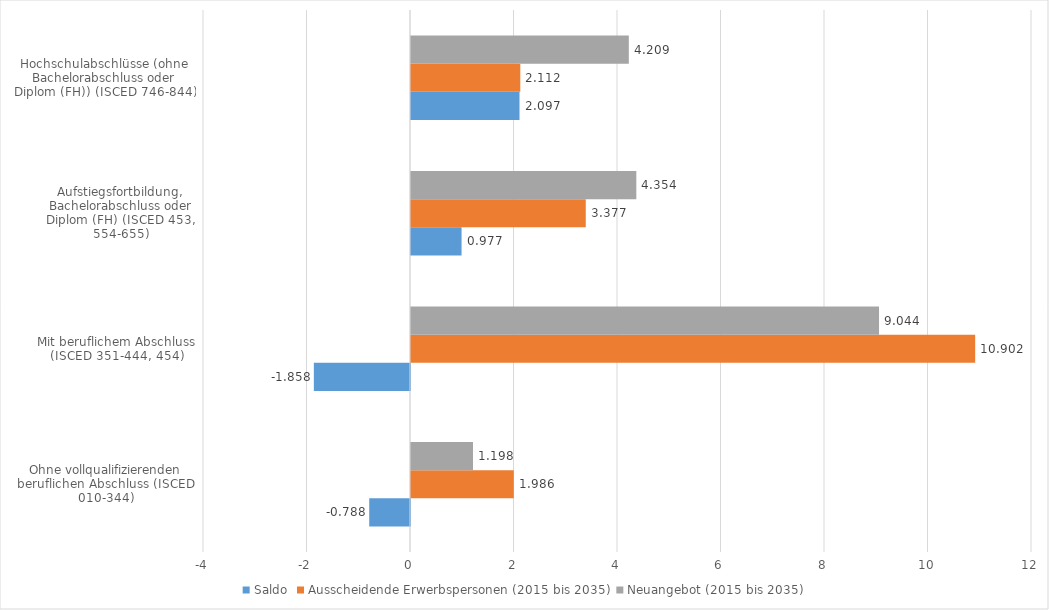
| Category | Saldo | Ausscheidende Erwerbspersonen (2015 bis 2035) | Neuangebot (2015 bis 2035) |
|---|---|---|---|
| Ohne vollqualifizierenden beruflichen Abschluss (ISCED 010-344) | -0.788 | 1.986 | 1.198 |
| Mit beruflichem Abschluss (ISCED 351-444, 454) | -1.858 | 10.902 | 9.044 |
| Aufstiegsfortbildung, Bachelorabschluss oder Diplom (FH) (ISCED 453, 554-655) | 0.977 | 3.377 | 4.354 |
| Hochschulabschlüsse (ohne Bachelorabschluss oder Diplom (FH)) (ISCED 746-844) | 2.097 | 2.112 | 4.209 |